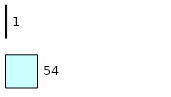
| Category | Series 0 | Series 1 |
|---|---|---|
| 0 | 54 | 1 |